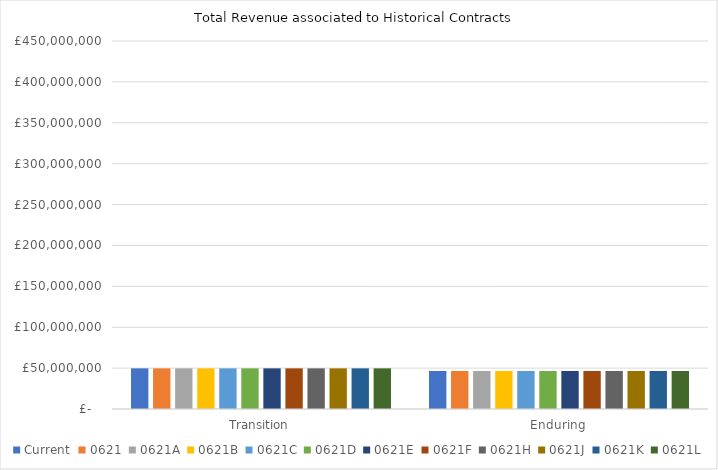
| Category | Current | 0621 | 0621A | 0621B | 0621C | 0621D | 0621E | 0621F | 0621H | 0621J | 0621K | 0621L |
|---|---|---|---|---|---|---|---|---|---|---|---|---|
| Transition | 49698418.001 | 49698418.001 | 49698418.001 | 49698418.001 | 49698418.001 | 49698418.001 | 49698418.001 | 49698418.001 | 49698418.001 | 49698418.001 | 49698418.001 | 49698418.001 |
| Enduring | 46506799.898 | 46506799.898 | 46506799.898 | 46506799.898 | 46506799.898 | 46506799.898 | 46506799.898 | 46506799.898 | 46506799.898 | 46506799.898 | 46506799.898 | 46506799.898 |